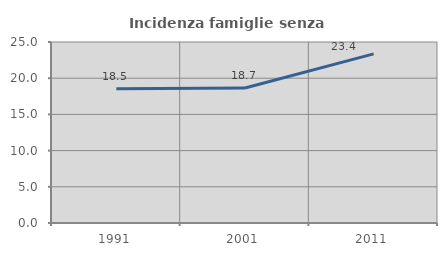
| Category | Incidenza famiglie senza nuclei |
|---|---|
| 1991.0 | 18.537 |
| 2001.0 | 18.657 |
| 2011.0 | 23.353 |